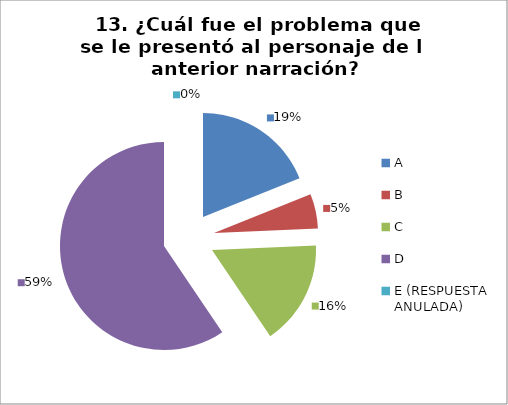
| Category | CANTIDAD DE RESPUESTAS PREGUNTA (13) | PORCENTAJE |
|---|---|---|
| A | 7 | 0.189 |
| B | 2 | 0.054 |
| C | 6 | 0.162 |
| D | 22 | 0.595 |
| E (RESPUESTA ANULADA) | 0 | 0 |